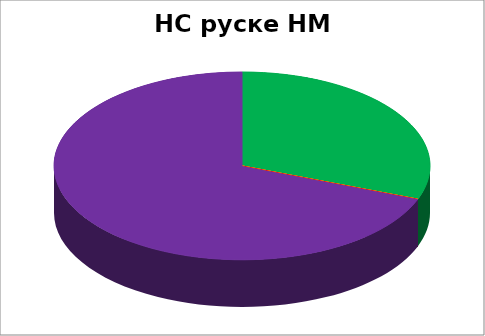
| Category | НС грчке НМ |
|---|---|
| 0 | 0.308 |
| 1 | 0 |
| 2 | 0 |
| 3 | 0 |
| 4 | 0.692 |